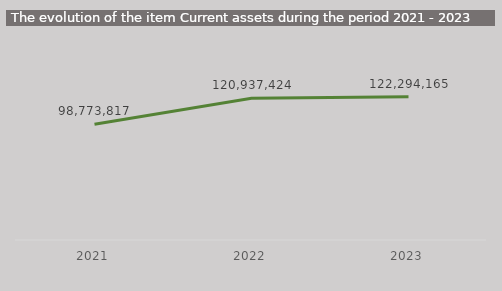
| Category | Series 0 |
|---|---|
| 2021.0 | 98773817 |
| 2022.0 | 120937424.48 |
| 2023.0 | 122294165 |